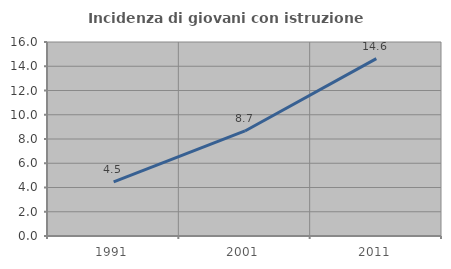
| Category | Incidenza di giovani con istruzione universitaria |
|---|---|
| 1991.0 | 4.459 |
| 2001.0 | 8.663 |
| 2011.0 | 14.627 |